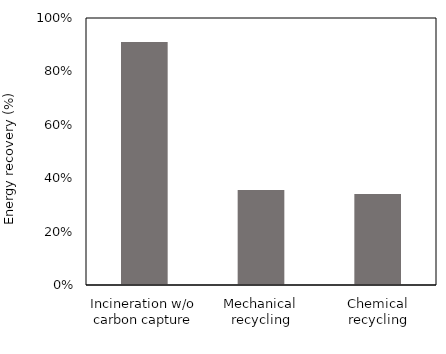
| Category | Energy recovered per generated waste (gross) |
|---|---|
| Incineration w/o carbon capture | 0.91 |
| Mechanical recycling | 0.355 |
| Chemical recycling | 0.341 |